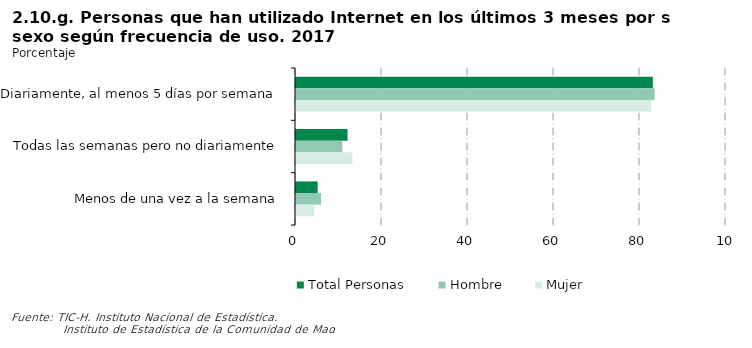
| Category | Total Personas | Hombre | Mujer |
|---|---|---|---|
| Diariamente, al menos 5 días por semana | 82.985 | 83.406 | 82.578 |
| Todas las semanas pero no diariamente | 11.981 | 10.768 | 13.151 |
| Menos de una vez a la semana | 5.035 | 5.826 | 4.271 |